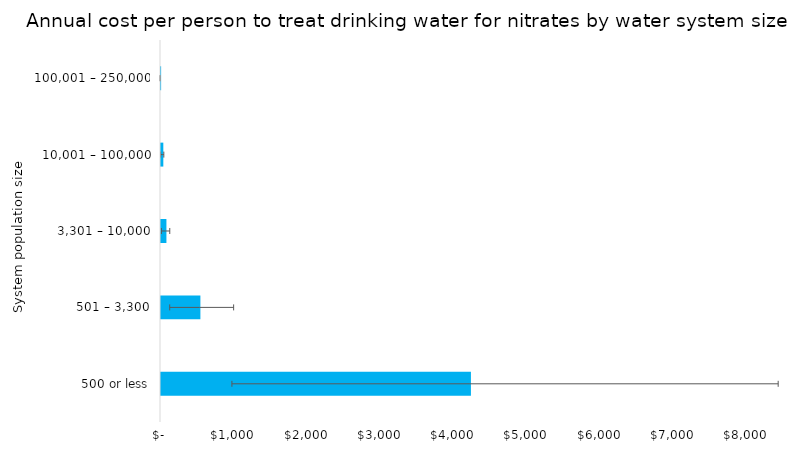
| Category | med/person |
|---|---|
| 500 or less | 4228.548 |
| 501 – 3,300 | 537.494 |
| 3,301 – 10,000 | 74.027 |
| 10,001 – 100,000 | 31.648 |
| 100,001 – 250,000 | 1.508 |